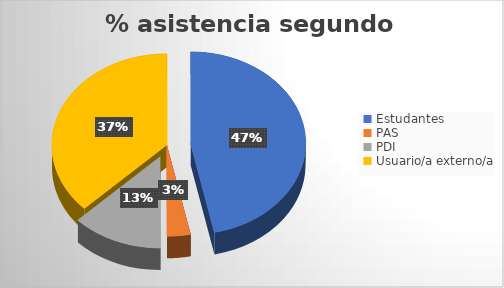
| Category | Series 0 |
|---|---|
| Estudantes | 654 |
| PAS | 46 |
| PDI | 179 |
| Usuario/a externo/a | 522 |